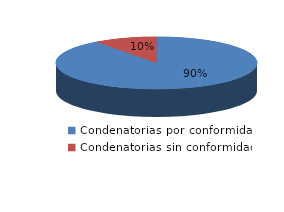
| Category | Series 0 |
|---|---|
| 0 | 870 |
| 1 | 97 |